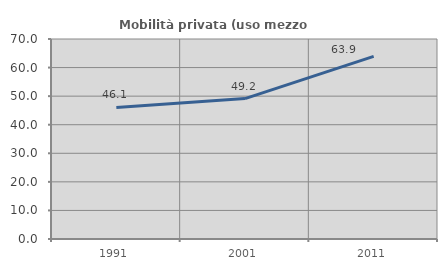
| Category | Mobilità privata (uso mezzo privato) |
|---|---|
| 1991.0 | 46.063 |
| 2001.0 | 49.153 |
| 2011.0 | 63.899 |